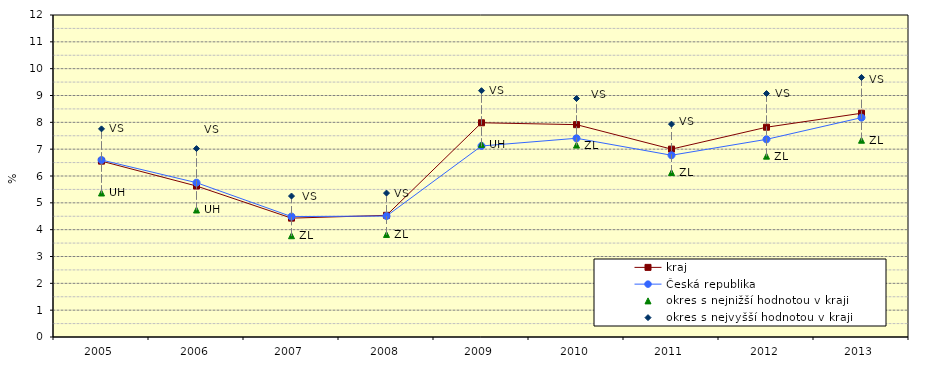
| Category | kraj | Česká republika | okres s nejnižší hodnotou v kraji | okres s nejvyšší hodnotou v kraji |
|---|---|---|---|---|
| 2005.0 | 6.554 | 6.596 | 5.367 | 7.757 |
| 2006.0 | 5.627 | 5.751 | 4.733 | 7.022 |
| 2007.0 | 4.43 | 4.488 | 3.775 | 5.253 |
| 2008.0 | 4.534 | 4.508 | 3.822 | 5.364 |
| 2009.0 | 7.983 | 7.118 | 7.179 | 9.179 |
| 2010.0 | 7.913 | 7.406 | 7.152 | 8.887 |
| 2011.0 | 7.002 | 6.774 | 6.128 | 7.933 |
| 2012.0 | 7.818 | 7.367 | 6.74 | 9.074 |
| 2013.0 | 8.339 | 8.175 | 7.333 | 9.673 |